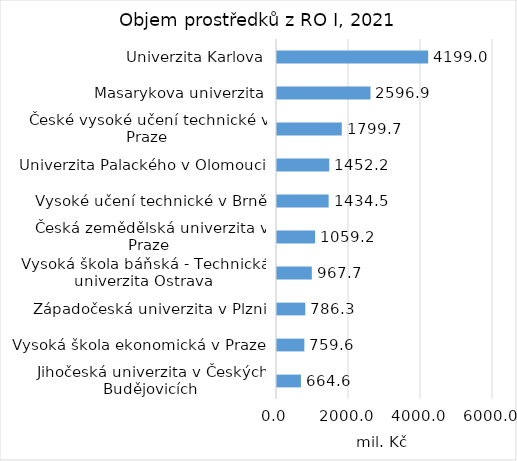
| Category | Series 0 |
|---|---|
| Jihočeská univerzita v Českých Budějovicích | 664.629 |
| Vysoká škola ekonomická v Praze | 759.595 |
| Západočeská univerzita v Plzni | 786.307 |
| Vysoká škola báňská - Technická univerzita Ostrava | 967.732 |
| Česká zemědělská univerzita v Praze | 1059.175 |
| Vysoké učení technické v Brně | 1434.528 |
| Univerzita Palackého v Olomouci | 1452.184 |
| České vysoké učení technické v Praze | 1799.706 |
| Masarykova univerzita | 2596.904 |
| Univerzita Karlova | 4198.991 |